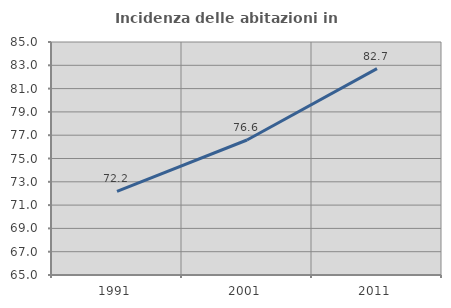
| Category | Incidenza delle abitazioni in proprietà  |
|---|---|
| 1991.0 | 72.182 |
| 2001.0 | 76.587 |
| 2011.0 | 82.714 |